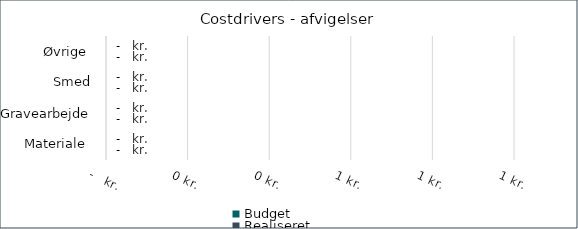
| Category | Budget | Realiseret |
|---|---|---|
| Materiale  | 0 | 0 |
| Gravearbejde | 0 | 0 |
| Smed | 0 | 0 |
| Øvrige  | 0 | 0 |